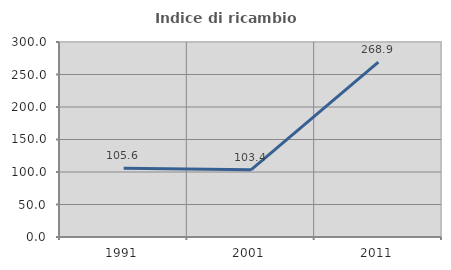
| Category | Indice di ricambio occupazionale  |
|---|---|
| 1991.0 | 105.618 |
| 2001.0 | 103.409 |
| 2011.0 | 268.889 |